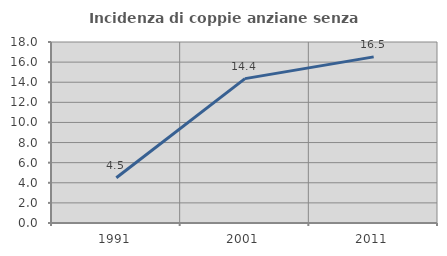
| Category | Incidenza di coppie anziane senza figli  |
|---|---|
| 1991.0 | 4.494 |
| 2001.0 | 14.356 |
| 2011.0 | 16.522 |